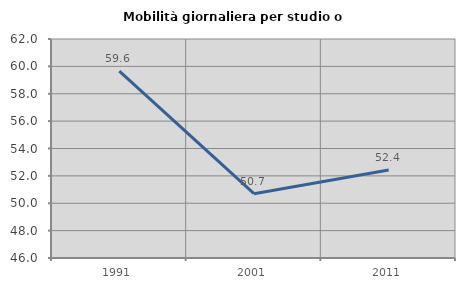
| Category | Mobilità giornaliera per studio o lavoro |
|---|---|
| 1991.0 | 59.648 |
| 2001.0 | 50.695 |
| 2011.0 | 52.434 |